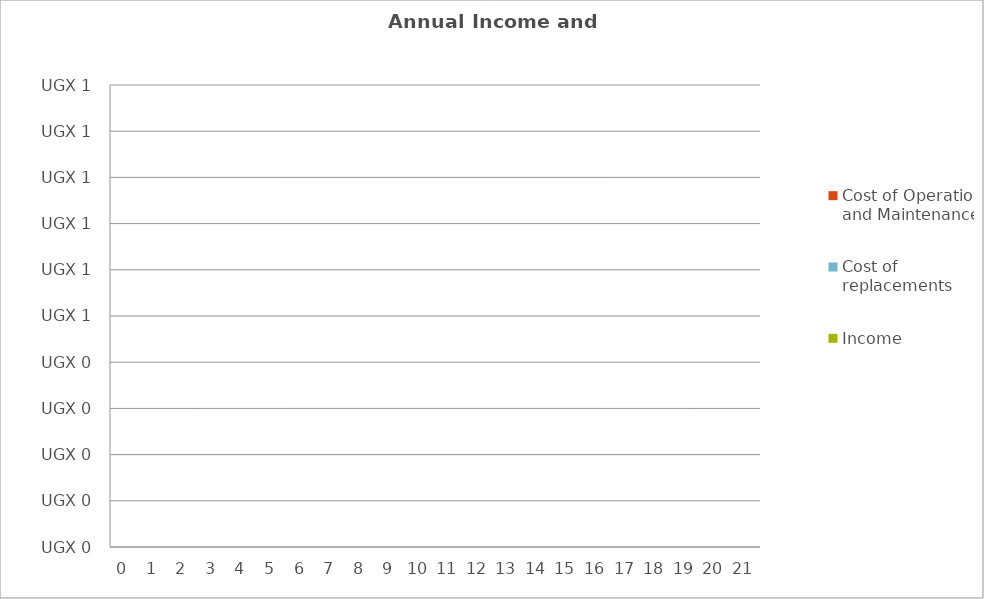
| Category | Cost of Operation and Maintenance | Cost of replacements | Income |
|---|---|---|---|
| 0.0 | 0 | 0 | 0 |
| 1.0 | 0 | 0 | 0 |
| 2.0 | 0 | 0 | 0 |
| 3.0 | 0 | 0 | 0 |
| 4.0 | 0 | 0 | 0 |
| 5.0 | 0 | 0 | 0 |
| 6.0 | 0 | 0 | 0 |
| 7.0 | 0 | 0 | 0 |
| 8.0 | 0 | 0 | 0 |
| 9.0 | 0 | 0 | 0 |
| 10.0 | 0 | 0 | 0 |
| 11.0 | 0 | 0 | 0 |
| 12.0 | 0 | 0 | 0 |
| 13.0 | 0 | 0 | 0 |
| 14.0 | 0 | 0 | 0 |
| 15.0 | 0 | 0 | 0 |
| 16.0 | 0 | 0 | 0 |
| 17.0 | 0 | 0 | 0 |
| 18.0 | 0 | 0 | 0 |
| 19.0 | 0 | 0 | 0 |
| 20.0 | 0 | 0 | 0 |
| 21.0 | 0 | 0 | 0 |